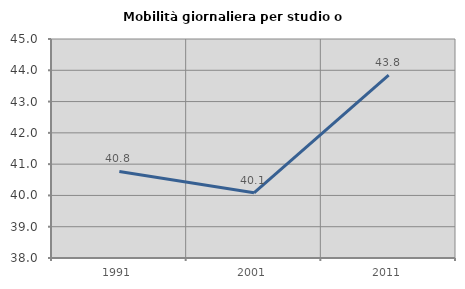
| Category | Mobilità giornaliera per studio o lavoro |
|---|---|
| 1991.0 | 40.766 |
| 2001.0 | 40.082 |
| 2011.0 | 43.843 |